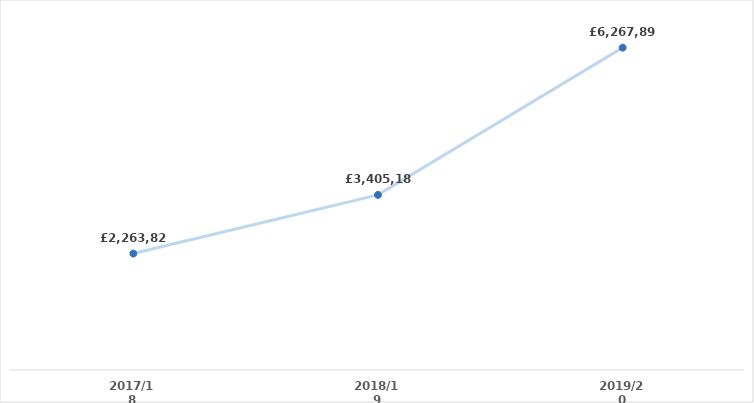
| Category | Series 0 |
|---|---|
| 2017/18 | 2263824.05 |
| 2018/19 | 3405185.02 |
| 2019/20 | 6267896.23 |